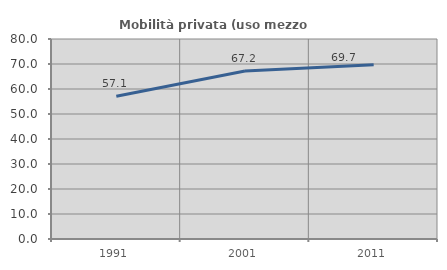
| Category | Mobilità privata (uso mezzo privato) |
|---|---|
| 1991.0 | 57.12 |
| 2001.0 | 67.164 |
| 2011.0 | 69.706 |